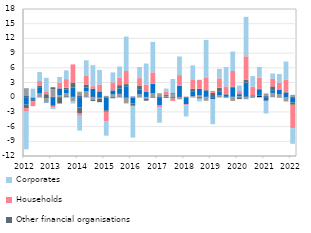
| Category | Non-profit and other organisations | Local authorities  | Currency in circulation | Other financial organisations | Households | Corporates |
|---|---|---|---|---|---|---|
| 2012 | 0.202 | 1.641 | -1.502 | -0.756 | -0.691 | -7.686 |
| II | 0.002 | -0.188 | -0.341 | -0.312 | -0.998 | 1.747 |
| III | 0.11 | 0.664 | 1.273 | 0.274 | 0.972 | 1.84 |
| IV | -0.138 | -0.873 | -0.098 | 0.61 | 0.594 | 2.749 |
| 2013 | 0.079 | 1.527 | -1.754 | 0.426 | -0.373 | -0.296 |
| II | 0.059 | 0.305 | 1.437 | -1.286 | 1.19 | 1.148 |
| III | 0.165 | 0.682 | 0.754 | 0.325 | 1.76 | 1.79 |
| IV | 0.076 | -0.87 | 1.873 | 1.027 | 3.718 | -0.415 |
| 2014 | 0.199 | 0.924 | -2.085 | -1.142 | -0.569 | -3.023 |
| II | 0.035 | 1.231 | 0.74 | 0.578 | 1.742 | 3.202 |
| III | 0.178 | -0.545 | 1.556 | -0.251 | 0.516 | 4.284 |
| IV | -0.104 | -0.237 | 1.19 | -0.68 | 1.391 | 3 |
| 2015 | -0.031 | 0.277 | -2.623 | -0.313 | -1.902 | -2.981 |
| II | 0.129 | 0.455 | 0.809 | -0.218 | 1.631 | 2.039 |
| III | 0.145 | 0.535 | 1.129 | 0.641 | 1.533 | 2.287 |
| IV | -0.109 | -1.155 | 2.237 | 0.437 | 2.676 | 7.032 |
| 2016 | 0.104 | -0.104 | -1.193 | -0.452 | -0.054 | -6.424 |
| II | -0.033 | 0.597 | 0.912 | 0.894 | 1.489 | 2.276 |
| III | 0.058 | -0.277 | 1.097 | -0.443 | 1.429 | 4.281 |
| IV | -0.001 | 0.781 | 1.984 | -0.118 | 2.31 | 6.213 |
| 2017 | 0.133 | 0.64 | -1.599 | 0.025 | -0.411 | -3.193 |
| II | 0.059 | 0.207 | -0.138 | 0.273 | 0.541 | 0.678 |
| III | 0.02 | 0.6 | 0.199 | -0.281 | -0.487 | 2.895 |
| IV | 0.183 | -0.435 | 2.116 | 0.066 | 2.148 | 3.798 |
| 2018 | -0.069 | 0.088 | -1.382 | 0.022 | -0.202 | -2.284 |
| II | 0.083 | 0.156 | 0.854 | 0.654 | 1.762 | 2.986 |
| III | 0.089 | 0.272 | 1.347 | -0.301 | 1.848 | -0.557 |
| IV | 0.082 | -0.727 | 1.258 | 0.234 | 2.481 | 7.641 |
| 2019 | 0.187 | 0.021 | -0.439 | 0.661 | 0.411 | -5.065 |
| II | -0.015 | 0.395 | 0.82 | 0.717 | 1.911 | 1.934 |
| III | 0.109 | -0.155 | 0.363 | 0.139 | 1.592 | 3.965 |
| IV | 0.106 | -0.756 | 1.801 | 0.269 | 3.171 | 3.974 |
| 2020 | -0.044 | 0.196 | 0.422 | -0.345 | 0.62 | 1.138 |
| II | 0.14 | -0.412 | 2.831 | 0.621 | 4.751 | 8.057 |
| III | 0.136 | 0.188 | -0.059 | 0.127 | 1.713 | 2.143 |
| IV | 0.323 | 0.01 | 1.279 | 0.077 | 2.288 | 2.209 |
| 2021 | 0.182 | 0.496 | -0.666 | -0.114 | 0.112 | -2.538 |
| II | 0.005 | 0.875 | 0.539 | 0.797 | 1.575 | 1.044 |
| III | 0.005 | 0.58 | 0.99 | -0.085 | 1.425 | 1.746 |
| IV | 0.001 | -0.875 | 0.906 | 0.121 | 2.584 | 3.656 |
| 2022 | 0.008 | 0.475 | -1.088 | -0.461 | -4.765 | -3.195 |